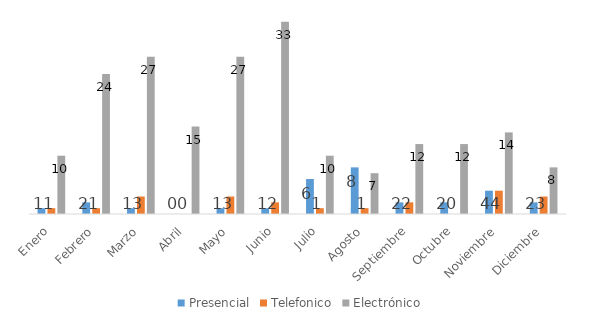
| Category | Presencial | Telefonico | Electrónico |
|---|---|---|---|
| Enero | 1 | 1 | 10 |
| Febrero | 2 | 1 | 24 |
| Marzo | 1 | 3 | 27 |
| Abril | 0 | 0 | 15 |
| Mayo | 1 | 3 | 27 |
| Junio | 1 | 2 | 33 |
| Julio | 6 | 1 | 10 |
| Agosto | 8 | 1 | 7 |
| Septiembre | 2 | 2 | 12 |
| Octubre | 2 | 0 | 12 |
| Noviembre | 4 | 4 | 14 |
| Diciembre | 2 | 3 | 8 |